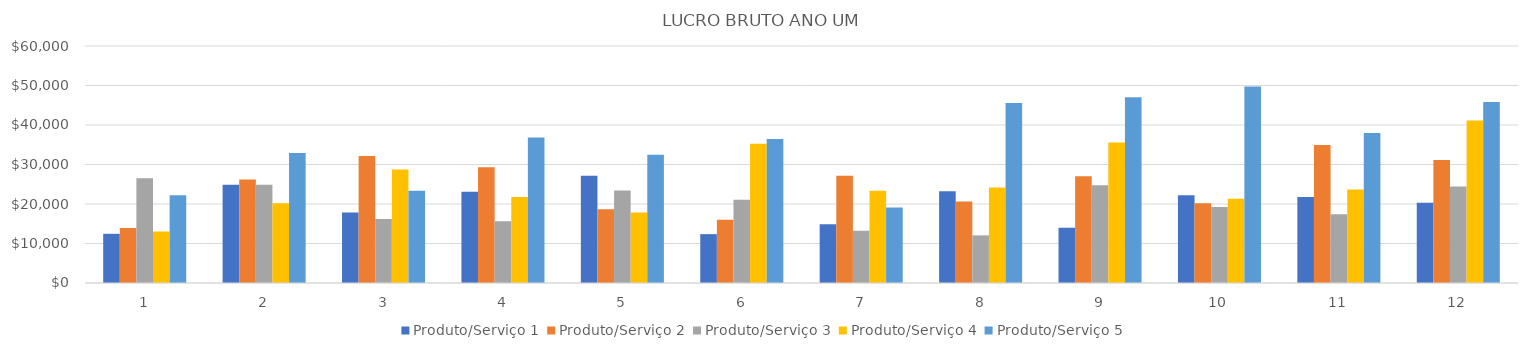
| Category | Produto/Serviço 1 | Produto/Serviço 2 | Produto/Serviço 3 | Produto/Serviço 4 | Produto/Serviço 5 |
|---|---|---|---|---|---|
| 0 | 12453 | 13896 | 26541 | 13024 | 22200 |
| 1 | 24899 | 26232 | 24858 | 20218 | 32880 |
| 2 | 17822 | 32152 | 16218 | 28743 | 23385 |
| 3 | 23107.5 | 29287.5 | 15623 | 21766.5 | 36815.5 |
| 4 | 27131 | 18660 | 23400.5 | 17871 | 32465.5 |
| 5 | 12369.5 | 15982.5 | 21063 | 35238 | 36438.5 |
| 6 | 14891.5 | 27142.5 | 13200.5 | 23331 | 19140 |
| 7 | 23211.5 | 20602.5 | 12061.5 | 24202.5 | 45559 |
| 8 | 14007.5 | 27052.5 | 24726.5 | 35595 | 47052.5 |
| 9 | 22218 | 20160 | 19233 | 21329 | 49770 |
| 10 | 21780 | 34920 | 17376 | 23647 | 38000 |
| 11 | 20340 | 31170 | 24420 | 41158 | 45840 |